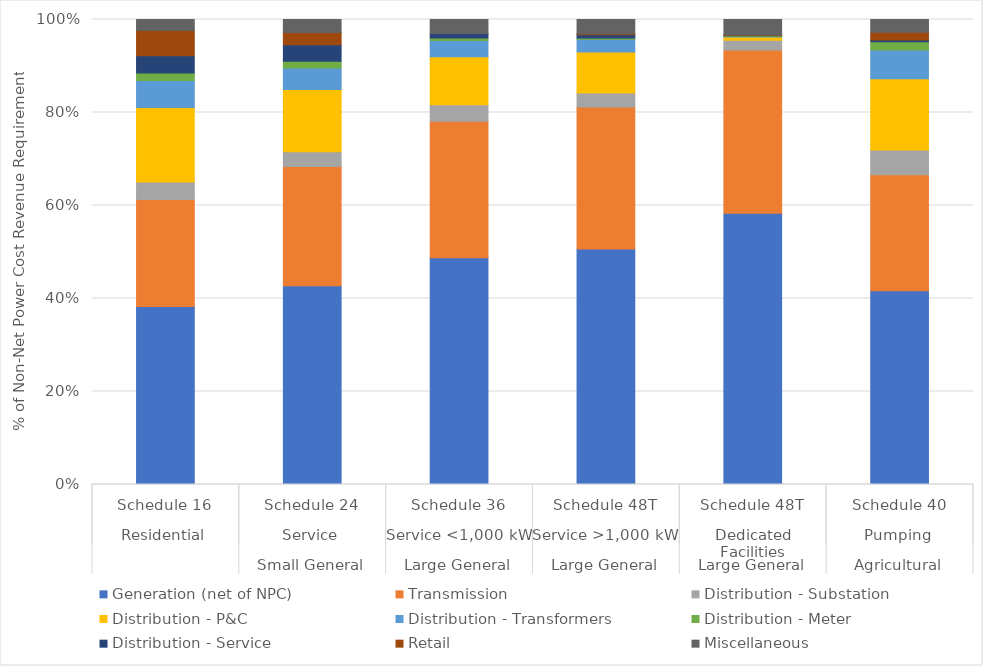
| Category | Generation (net of NPC) | Transmission | Distribution - Substation | Distribution - P&C | Distribution - Transformers | Distribution - Meter | Distribution - Service | Retail | Miscellaneous |
|---|---|---|---|---|---|---|---|---|---|
| 0 | 40598984.369 | 24378159.284 | 3997981.753 | 16940841.682 | 6154571.181 | 1711108.042 | 3973533.981 | 5717957.99 | 2517612.564 |
| 1 | 12679449.608 | 7607593.909 | 934817.758 | 3969104.567 | 1377426.586 | 428360.367 | 1061756.7 | 767852.252 | 835403.133 |
| 2 | 20179027.481 | 12166442.611 | 1455131.52 | 4274434.013 | 1461427.08 | 210722.258 | 397923.918 | -196.162 | 1253598.229 |
| 3 | 8230263.325 | 4962387.913 | 489657.494 | 1431253.826 | 447091.395 | 40541.015 | 117708.125 | 29122.59 | 500631.63 |
| 4 | 9054923.85 | 5459581.281 | 321025.348 | 110765.222 | 16184.141 | 23648.189 | 9459.359 | 14787.6 | 518592.717 |
| 5 | 3326301.299 | 1989846.17 | 424927.306 | 1226292.073 | 492752.628 | 141149.284 | 28998.583 | 131819.325 | 220306.86 |